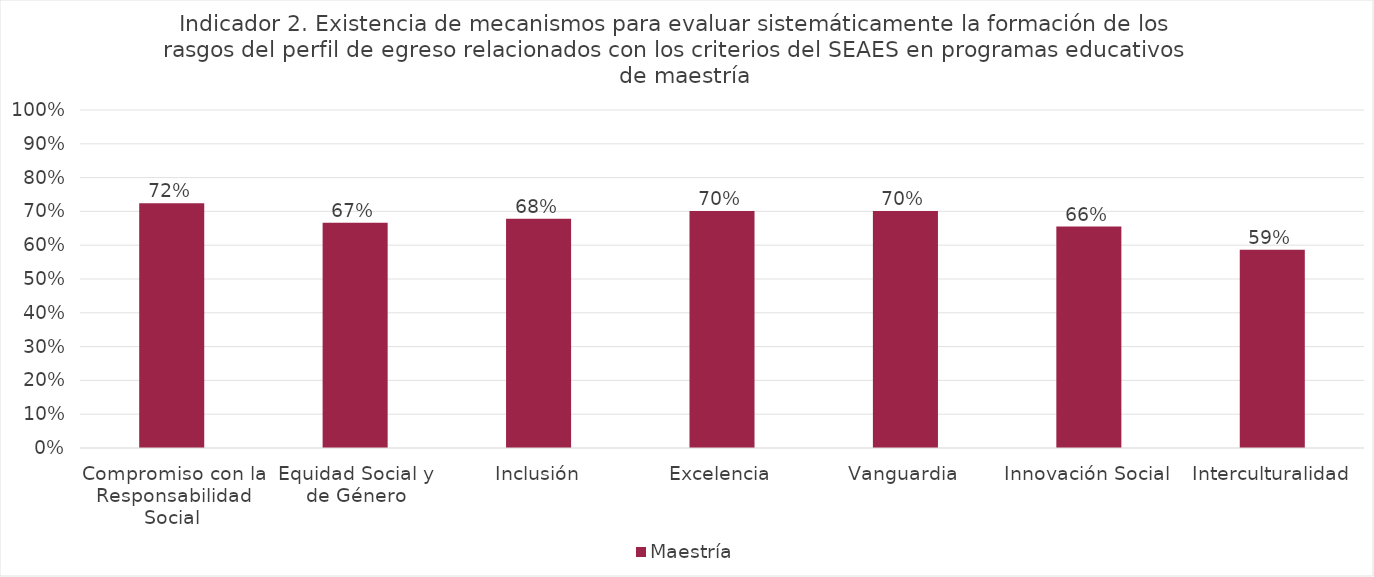
| Category | Maestría |
|---|---|
| Compromiso con la Responsabilidad Social | 0.724 |
| Equidad Social y de Género | 0.667 |
| Inclusión | 0.678 |
| Excelencia | 0.701 |
| Vanguardia | 0.701 |
| Innovación Social | 0.655 |
| Interculturalidad | 0.586 |